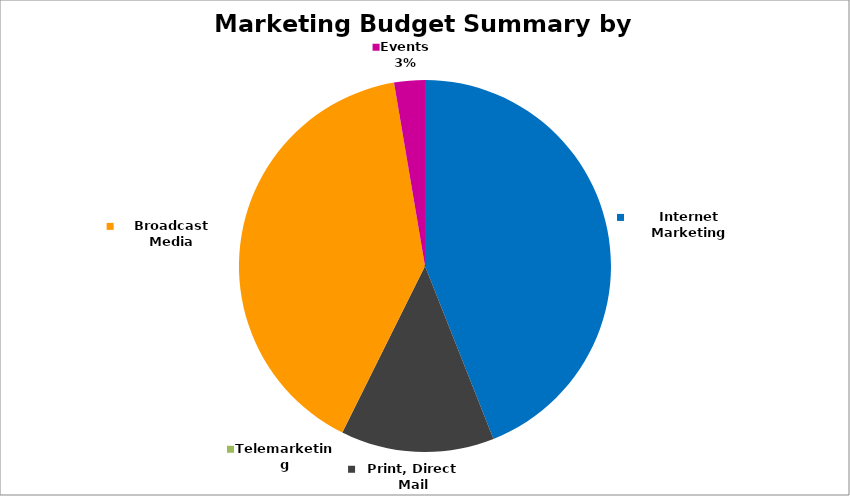
| Category | Annual by Catagory |
|---|---|
| Internet Marketing | 198000 |
| Print, Direct Mail | 60000 |
| Telemarketing | 0 |
| Broadcast Media | 180000 |
| Events | 12000 |